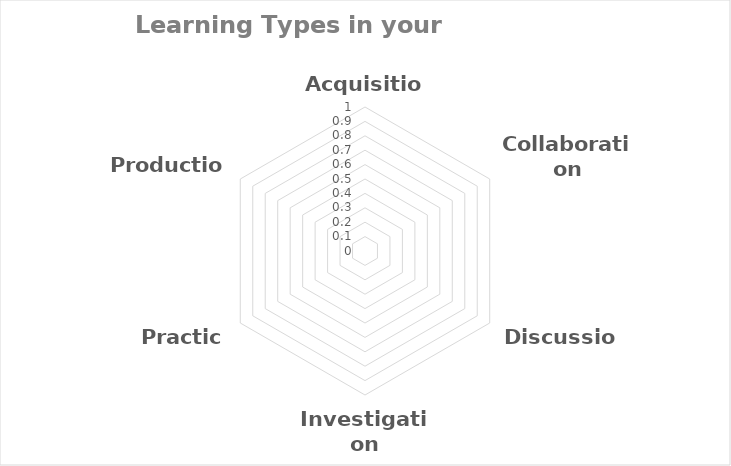
| Category | Series 0 | Acquisition |
|---|---|---|
| Acquisition | 0 | 0 |
| Collaboration | 0 | 0 |
| Discussion | 0 | 0 |
| Investigation | 0 | 0 |
| Practice | 0 | 0 |
| Production | 0 | 0 |